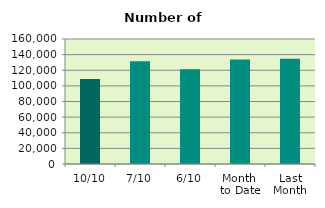
| Category | Series 0 |
|---|---|
| 10/10 | 108914 |
| 7/10 | 131370 |
| 6/10 | 121376 |
| Month 
to Date | 133850 |
| Last
Month | 134880 |